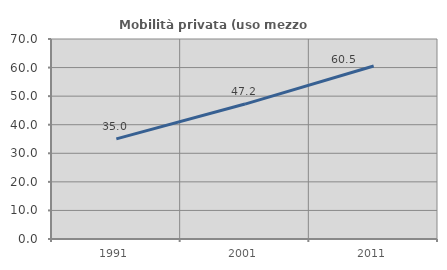
| Category | Mobilità privata (uso mezzo privato) |
|---|---|
| 1991.0 | 35.033 |
| 2001.0 | 47.226 |
| 2011.0 | 60.538 |